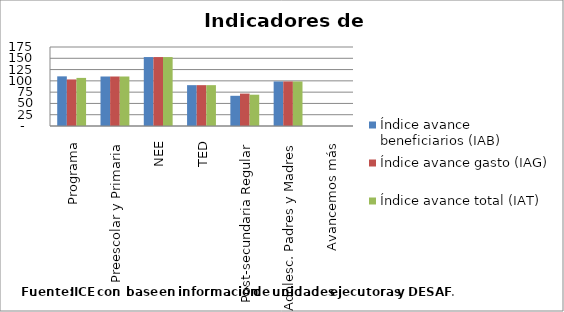
| Category | Índice avance beneficiarios (IAB)  | Índice avance gasto (IAG) | Índice avance total (IAT)  |
|---|---|---|---|
| Programa | 109.99 | 103.121 | 106.556 |
| Preescolar y Primaria | 109.648 | 109.648 | 109.648 |
| NEE | 152.718 | 152.715 | 152.716 |
| TED | 90.482 | 90.482 | 90.482 |
| Post-secundaria Regular | 66.893 | 71.76 | 69.327 |
| Adolesc. Padres y Madres | 98.679 | 98.679 | 98.679 |
| Avancemos más | 0 | 0 | 0 |